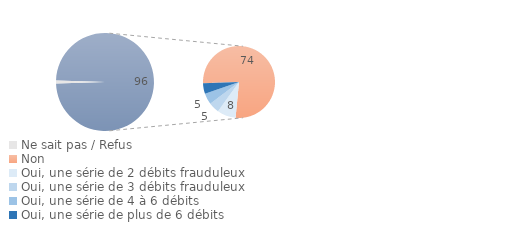
| Category | Series 0 |
|---|---|
| Ne sait pas / Refus | 1 |
| Non  | 74.064 |
| Oui, une série de 2 débits frauduleux | 8.064 |
| Oui, une série de 3 débits frauduleux | 4.601 |
| Oui, une série de 4 à 6 débits | 4.788 |
| Oui, une série de plus de 6 débits | 4.621 |